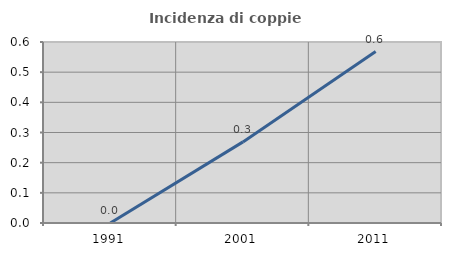
| Category | Incidenza di coppie miste |
|---|---|
| 1991.0 | 0 |
| 2001.0 | 0.269 |
| 2011.0 | 0.568 |